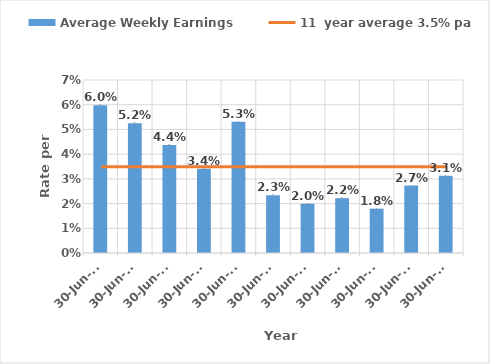
| Category | Average Weekly Earnings |
|---|---|
| 2009-06-30 | 0.06 |
| 2010-06-30 | 0.052 |
| 2011-06-30 | 0.044 |
| 2012-06-30 | 0.034 |
| 2013-06-30 | 0.053 |
| 2014-06-30 | 0.023 |
| 2015-06-30 | 0.02 |
| 2016-06-30 | 0.022 |
| 2017-06-30 | 0.018 |
| 2018-06-30 | 0.027 |
| 2019-06-30 | 0.031 |